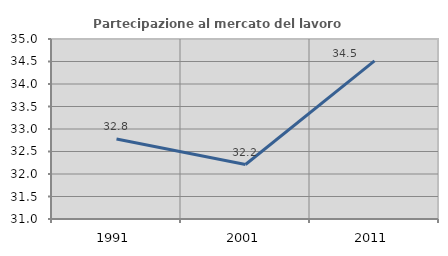
| Category | Partecipazione al mercato del lavoro  femminile |
|---|---|
| 1991.0 | 32.776 |
| 2001.0 | 32.211 |
| 2011.0 | 34.512 |